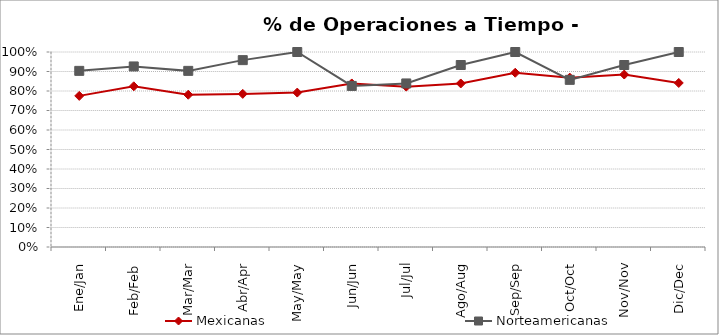
| Category | Mexicanas | Norteamericanas |
|---|---|---|
| Ene/Jan | 0.775 | 0.903 |
| Feb/Feb | 0.824 | 0.926 |
| Mar/Mar | 0.781 | 0.903 |
| Abr/Apr | 0.785 | 0.958 |
| May/May | 0.792 | 1 |
| Jun/Jun | 0.839 | 0.826 |
| Jul/Jul | 0.822 | 0.839 |
| Ago/Aug | 0.839 | 0.933 |
| Sep/Sep | 0.894 | 1 |
| Oct/Oct | 0.869 | 0.857 |
| Nov/Nov | 0.885 | 0.933 |
| Dic/Dec | 0.841 | 1 |